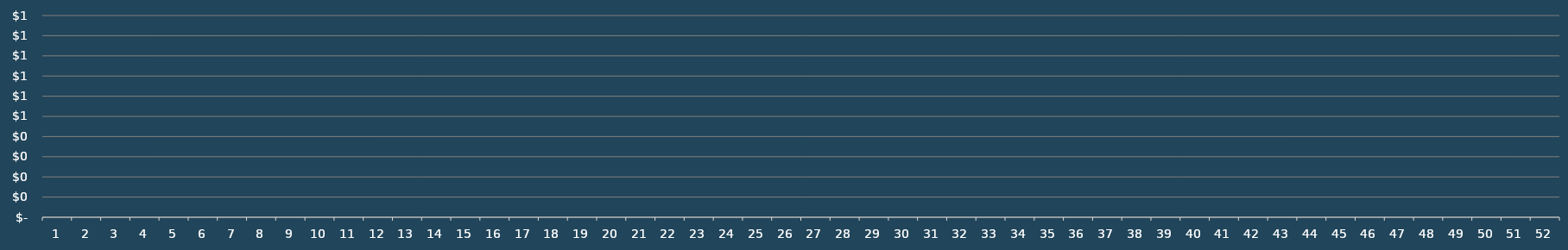
| Category | Revenue Per Acquisition |
|---|---|
| 1.0 | 0 |
| 2.0 | 0 |
| 3.0 | 0 |
| 4.0 | 0 |
| 5.0 | 0 |
| 6.0 | 0 |
| 7.0 | 0 |
| 8.0 | 0 |
| 9.0 | 0 |
| 10.0 | 0 |
| 11.0 | 0 |
| 12.0 | 0 |
| 13.0 | 0 |
| 14.0 | 0 |
| 15.0 | 0 |
| 16.0 | 0 |
| 17.0 | 0 |
| 18.0 | 0 |
| 19.0 | 0 |
| 20.0 | 0 |
| 21.0 | 0 |
| 22.0 | 0 |
| 23.0 | 0 |
| 24.0 | 0 |
| 25.0 | 0 |
| 26.0 | 0 |
| 27.0 | 0 |
| 28.0 | 0 |
| 29.0 | 0 |
| 30.0 | 0 |
| 31.0 | 0 |
| 32.0 | 0 |
| 33.0 | 0 |
| 34.0 | 0 |
| 35.0 | 0 |
| 36.0 | 0 |
| 37.0 | 0 |
| 38.0 | 0 |
| 39.0 | 0 |
| 40.0 | 0 |
| 41.0 | 0 |
| 42.0 | 0 |
| 43.0 | 0 |
| 44.0 | 0 |
| 45.0 | 0 |
| 46.0 | 0 |
| 47.0 | 0 |
| 48.0 | 0 |
| 49.0 | 0 |
| 50.0 | 0 |
| 51.0 | 0 |
| 52.0 | 0 |